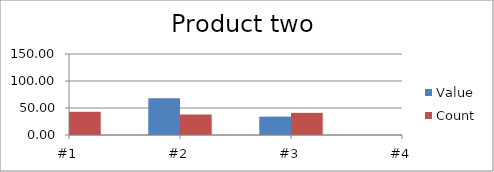
| Category | Value | Count |
|---|---|---|
| #1 | 100 | 43 |
| #2 | 68 | 38 |
| #3 | 34 | 41 |
| #4 | 0 | 36 |